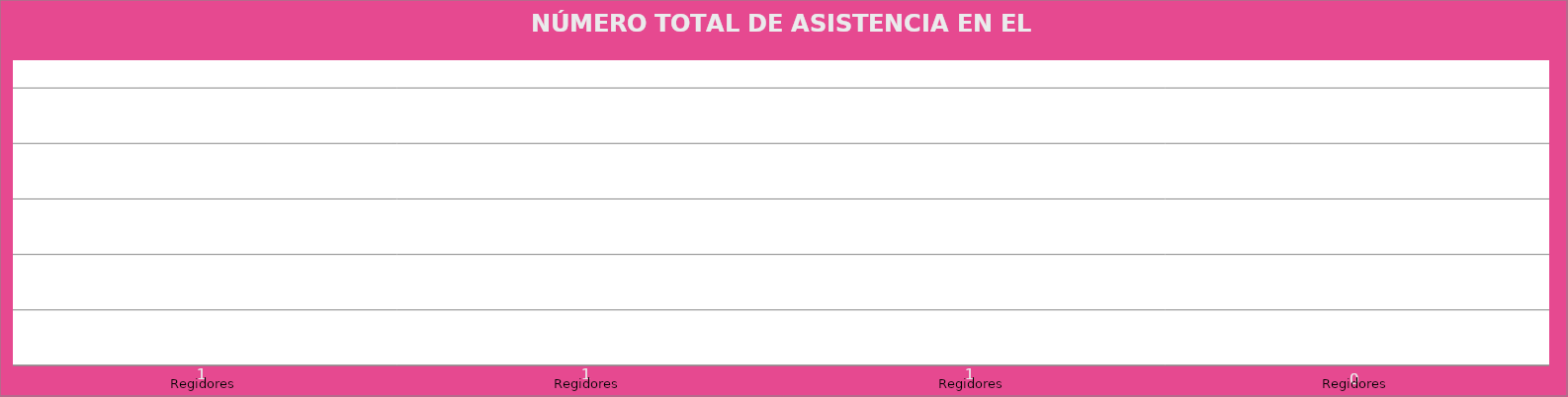
| Category | Regidores |
|---|---|
| Regidores | 1 |
| Regidores | 1 |
| Regidores | 1 |
| Regidores | 0 |